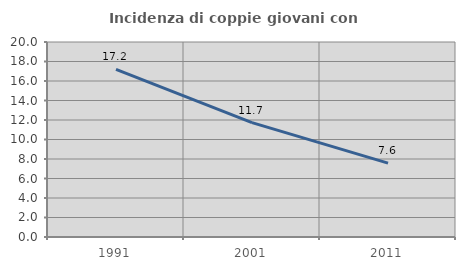
| Category | Incidenza di coppie giovani con figli |
|---|---|
| 1991.0 | 17.186 |
| 2001.0 | 11.733 |
| 2011.0 | 7.583 |